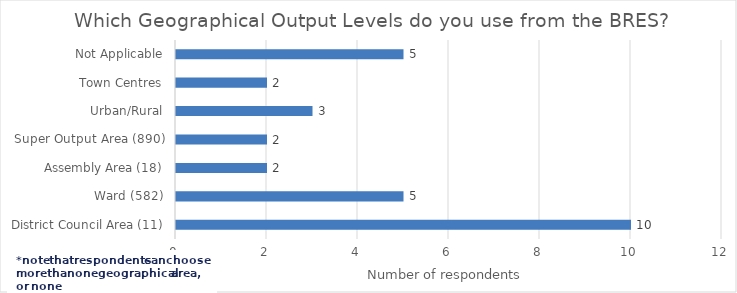
| Category | Series 0 |
|---|---|
| District Council Area (11) | 10 |
| Ward (582) | 5 |
| Assembly Area (18) | 2 |
| Super Output Area (890) | 2 |
| Urban/Rural | 3 |
| Town Centres | 2 |
| Not Applicable | 5 |